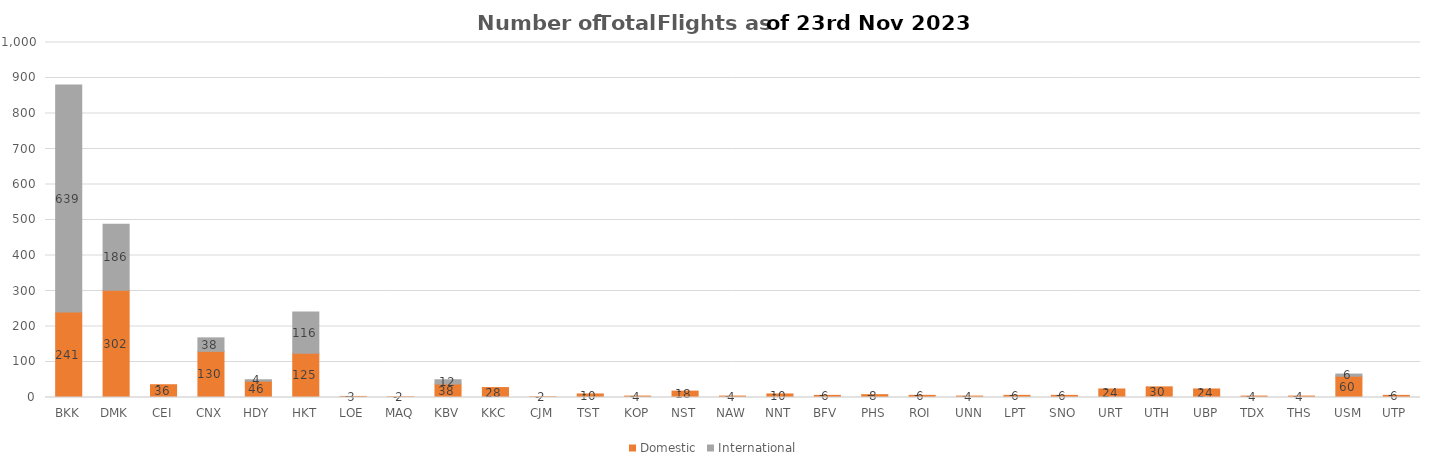
| Category | Domestic | International |
|---|---|---|
| BKK | 241 | 639 |
| DMK | 302 | 186 |
| CEI | 36 | 0 |
| CNX | 130 | 38 |
| HDY | 46 | 4 |
| HKT | 125 | 116 |
| LOE | 3 | 0 |
| MAQ | 2 | 0 |
| KBV | 38 | 12 |
| KKC | 28 | 0 |
| CJM | 2 | 0 |
| TST | 10 | 0 |
| KOP | 4 | 0 |
| NST | 18 | 0 |
| NAW | 4 | 0 |
| NNT | 10 | 0 |
| BFV | 6 | 0 |
| PHS | 8 | 0 |
| ROI | 6 | 0 |
| UNN | 4 | 0 |
| LPT | 6 | 0 |
| SNO | 6 | 0 |
| URT | 24 | 0 |
| UTH | 30 | 0 |
| UBP | 24 | 0 |
| TDX | 4 | 0 |
| THS | 4 | 0 |
| USM | 60 | 6 |
| UTP | 6 | 0 |